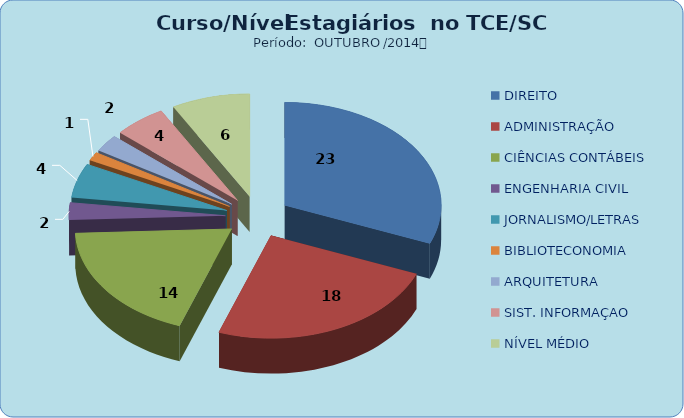
| Category | Series 0 |
|---|---|
| DIREITO | 23 |
| ADMINISTRAÇÃO | 18 |
| CIÊNCIAS CONTÁBEIS | 14 |
| ENGENHARIA CIVIL | 2 |
| JORNALISMO/LETRAS | 4 |
| BIBLIOTECONOMIA | 1 |
| ARQUITETURA | 2 |
| SIST. INFORMAÇAO | 4 |
| NÍVEL MÉDIO | 6 |